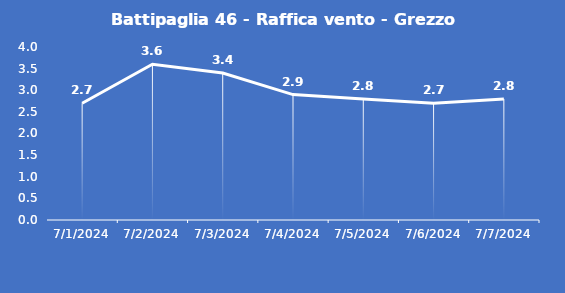
| Category | Battipaglia 46 - Raffica vento - Grezzo (m/s) |
|---|---|
| 7/1/24 | 2.7 |
| 7/2/24 | 3.6 |
| 7/3/24 | 3.4 |
| 7/4/24 | 2.9 |
| 7/5/24 | 2.8 |
| 7/6/24 | 2.7 |
| 7/7/24 | 2.8 |